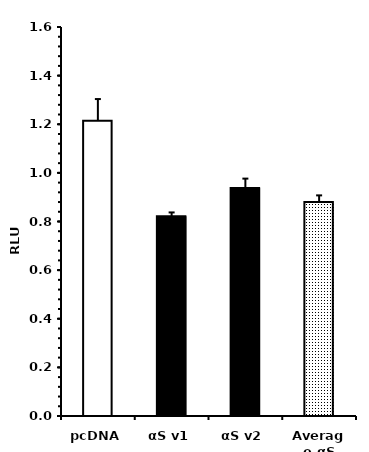
| Category | Series 0 |
|---|---|
| pcDNA | 1.214 |
| αS v1 | 0.822 |
| αS v2 | 0.938 |
| Average αS | 0.88 |